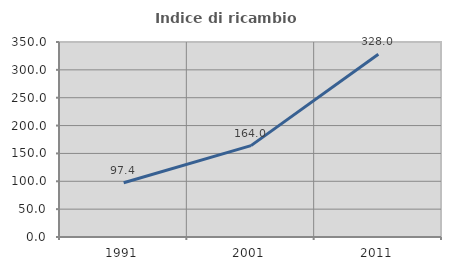
| Category | Indice di ricambio occupazionale  |
|---|---|
| 1991.0 | 97.397 |
| 2001.0 | 164.009 |
| 2011.0 | 328.03 |